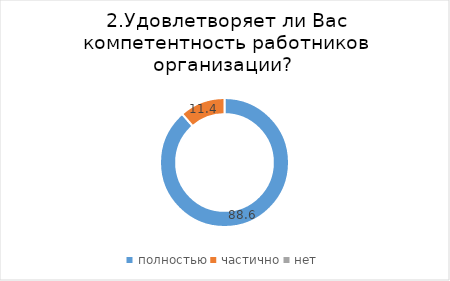
| Category | Series 0 |
|---|---|
| полностью | 88.593 |
| частично | 11.407 |
| нет | 0 |